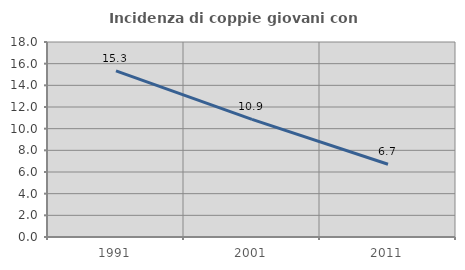
| Category | Incidenza di coppie giovani con figli |
|---|---|
| 1991.0 | 15.338 |
| 2001.0 | 10.858 |
| 2011.0 | 6.715 |